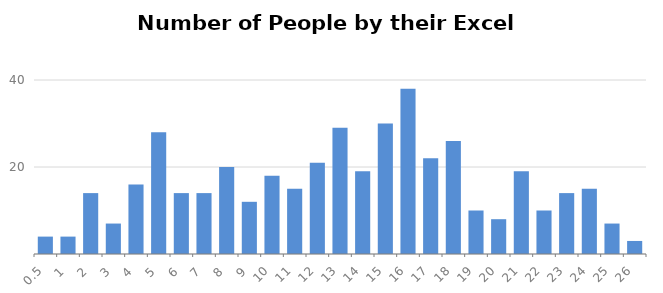
| Category | Number of People |
|---|---|
| 0.5 | 4 |
| 1.0 | 4 |
| 2.0 | 14 |
| 3.0 | 7 |
| 4.0 | 16 |
| 5.0 | 28 |
| 6.0 | 14 |
| 7.0 | 14 |
| 8.0 | 20 |
| 9.0 | 12 |
| 10.0 | 18 |
| 11.0 | 15 |
| 12.0 | 21 |
| 13.0 | 29 |
| 14.0 | 19 |
| 15.0 | 30 |
| 16.0 | 38 |
| 17.0 | 22 |
| 18.0 | 26 |
| 19.0 | 10 |
| 20.0 | 8 |
| 21.0 | 19 |
| 22.0 | 10 |
| 23.0 | 14 |
| 24.0 | 15 |
| 25.0 | 7 |
| 26.0 | 3 |